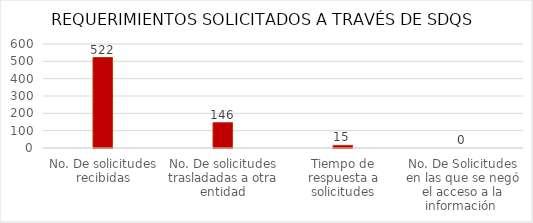
| Category | Series 0 |
|---|---|
| No. De solicitudes recibidas | 522 |
| No. De solicitudes trasladadas a otra entidad | 146 |
| Tiempo de respuesta a solicitudes | 15 |
| No. De Solicitudes en las que se negó el acceso a la información  | 0 |